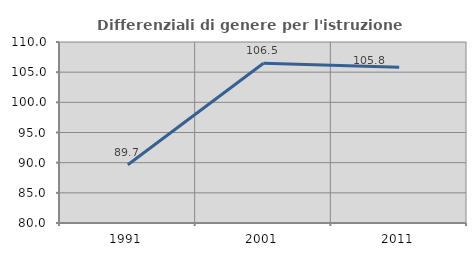
| Category | Differenziali di genere per l'istruzione superiore |
|---|---|
| 1991.0 | 89.661 |
| 2001.0 | 106.468 |
| 2011.0 | 105.835 |